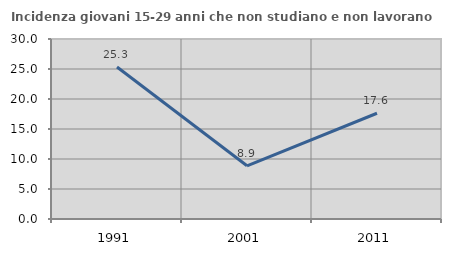
| Category | Incidenza giovani 15-29 anni che non studiano e non lavorano  |
|---|---|
| 1991.0 | 25.325 |
| 2001.0 | 8.868 |
| 2011.0 | 17.627 |